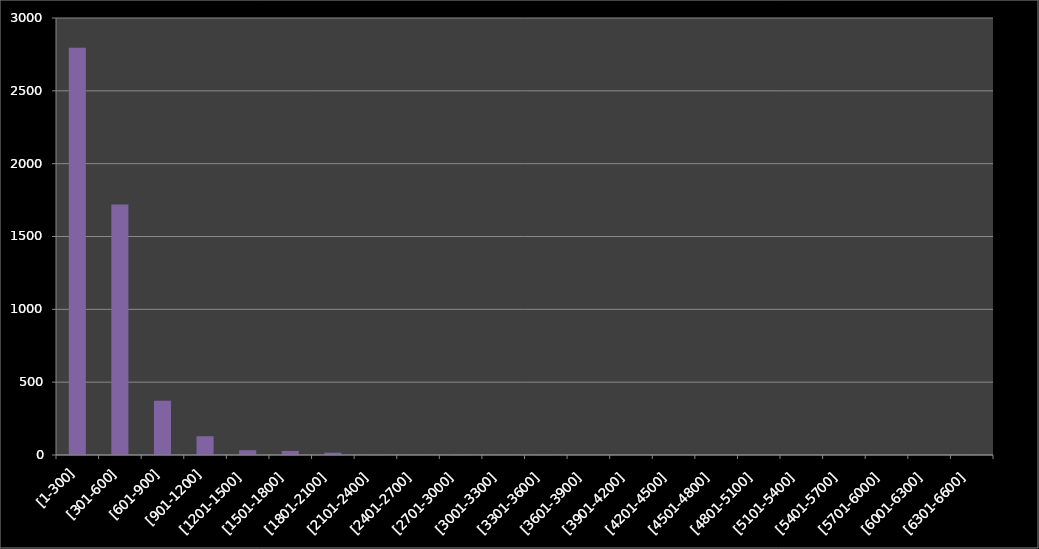
| Category | Series 0 |
|---|---|
| [1-300] | 2795 |
| [301-600] | 1720 |
| [601-900] | 373 |
| [901-1200] | 129 |
| [1201-1500] | 33 |
| [1501-1800] | 28 |
| [1801-2100] | 16 |
| [2101-2400] | 2 |
| [2401-2700] | 1 |
| [2701-3000] | 4 |
| [3001-3300] | 1 |
| [3301-3600] | 2 |
| [3601-3900] | 0 |
| [3901-4200] | 0 |
| [4201-4500] | 0 |
| [4501-4800] | 0 |
| [4801-5100] | 0 |
| [5101-5400] | 0 |
| [5401-5700] | 0 |
| [5701-6000] | 0 |
| [6001-6300] | 0 |
| [6301-6600] | 1 |